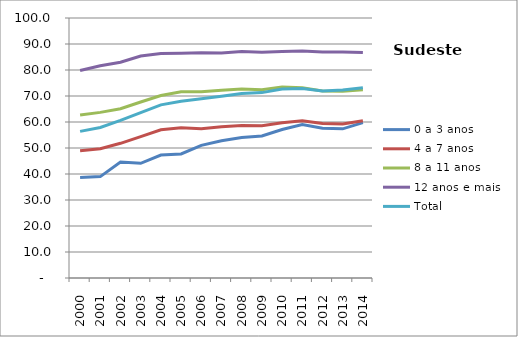
| Category | 0 a 3 anos | 4 a 7 anos | 8 a 11 anos | 12 anos e mais | Total |
|---|---|---|---|---|---|
| 2000.0 | 38.7 | 48.9 | 62.7 | 79.8 | 56.4 |
| 2001.0 | 39 | 49.7 | 63.7 | 81.6 | 57.9 |
| 2002.0 | 44.6 | 51.8 | 65.1 | 83 | 60.6 |
| 2003.0 | 44.1 | 54.4 | 67.7 | 85.4 | 63.6 |
| 2004.0 | 47.3 | 57 | 70.2 | 86.3 | 66.6 |
| 2005.0 | 47.7 | 57.8 | 71.6 | 86.4 | 68 |
| 2006.0 | 51 | 57.4 | 71.6 | 86.6 | 68.9 |
| 2007.0 | 52.8 | 58.2 | 72.2 | 86.5 | 69.9 |
| 2008.0 | 54 | 58.7 | 72.7 | 87.1 | 71 |
| 2009.0 | 54.6 | 58.6 | 72.4 | 86.8 | 71.3 |
| 2010.0 | 57.133 | 59.676 | 73.442 | 87.079 | 72.703 |
| 2011.0 | 59.007 | 60.513 | 73.185 | 87.281 | 72.914 |
| 2012.0 | 57.565 | 59.428 | 71.933 | 86.915 | 71.969 |
| 2013.0 | 57.361 | 59.245 | 71.868 | 86.91 | 72.283 |
| 2014.0 | 59.783 | 60.511 | 72.398 | 86.696 | 73.211 |